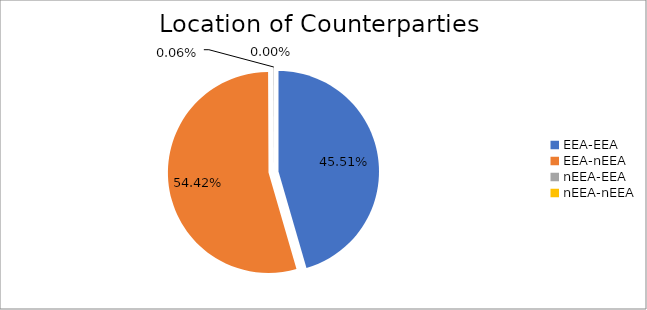
| Category | Series 0 |
|---|---|
| EEA-EEA | 4977178.084 |
| EEA-nEEA | 5951924.556 |
| nEEA-EEA | 6739.228 |
| nEEA-nEEA | 466.435 |